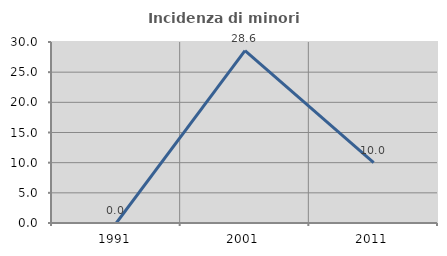
| Category | Incidenza di minori stranieri |
|---|---|
| 1991.0 | 0 |
| 2001.0 | 28.571 |
| 2011.0 | 10 |